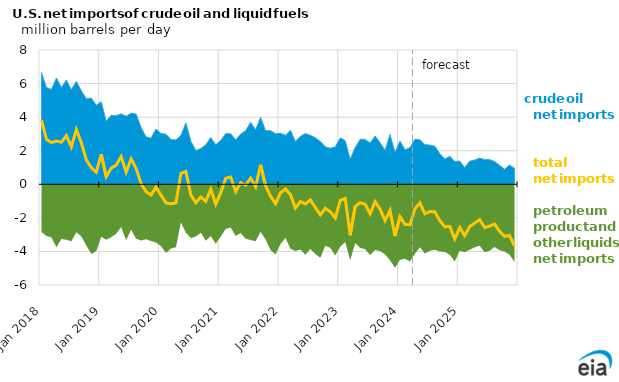
| Category | total net imports  |
|---|---|
| 2018-01-01 | 3.819 |
| 2018-02-01 | 2.679 |
| 2018-03-01 | 2.485 |
| 2018-04-01 | 2.578 |
| 2018-05-01 | 2.51 |
| 2018-06-01 | 2.902 |
| 2018-07-01 | 2.231 |
| 2018-08-01 | 3.27 |
| 2018-09-01 | 2.474 |
| 2018-10-01 | 1.457 |
| 2018-11-01 | 0.991 |
| 2018-12-01 | 0.72 |
| 2019-01-01 | 1.786 |
| 2019-02-01 | 0.452 |
| 2019-03-01 | 0.959 |
| 2019-04-01 | 1.143 |
| 2019-05-01 | 1.655 |
| 2019-06-01 | 0.72 |
| 2019-07-01 | 1.517 |
| 2019-08-01 | 0.949 |
| 2019-09-01 | 0.04 |
| 2019-10-01 | -0.44 |
| 2019-11-01 | -0.638 |
| 2019-12-01 | -0.171 |
| 2020-01-01 | -0.649 |
| 2020-02-01 | -1.108 |
| 2020-03-01 | -1.162 |
| 2020-04-01 | -1.112 |
| 2020-05-01 | 0.65 |
| 2020-06-01 | 0.76 |
| 2020-07-01 | -0.639 |
| 2020-08-01 | -1.1 |
| 2020-09-01 | -0.756 |
| 2020-10-01 | -1.013 |
| 2020-11-01 | -0.297 |
| 2020-12-01 | -1.186 |
| 2021-01-01 | -0.501 |
| 2021-02-01 | 0.357 |
| 2021-03-01 | 0.431 |
| 2021-04-01 | -0.441 |
| 2021-05-01 | 0.098 |
| 2021-06-01 | -0.056 |
| 2021-07-01 | 0.368 |
| 2021-08-01 | -0.153 |
| 2021-09-01 | 1.162 |
| 2021-10-01 | -0.09 |
| 2021-11-01 | -0.71 |
| 2021-12-01 | -1.161 |
| 2022-01-01 | -0.513 |
| 2022-02-01 | -0.278 |
| 2022-03-01 | -0.621 |
| 2022-04-01 | -1.418 |
| 2022-05-01 | -1.031 |
| 2022-06-01 | -1.173 |
| 2022-07-01 | -0.931 |
| 2022-08-01 | -1.38 |
| 2022-09-01 | -1.825 |
| 2022-10-01 | -1.43 |
| 2022-11-01 | -1.637 |
| 2022-12-01 | -2.009 |
| 2023-01-01 | -0.964 |
| 2023-02-01 | -0.843 |
| 2023-03-01 | -3.035 |
| 2023-04-01 | -1.312 |
| 2023-05-01 | -1.1 |
| 2023-06-01 | -1.192 |
| 2023-07-01 | -1.758 |
| 2023-08-01 | -1.03 |
| 2023-09-01 | -1.485 |
| 2023-10-01 | -2.16 |
| 2023-11-01 | -1.556 |
| 2023-12-01 | -3.085 |
| 2024-01-01 | -1.923 |
| 2024-02-01 | -2.385 |
| 2024-03-01 | -2.415 |
| 2024-04-01 | -1.459 |
| 2024-05-01 | -1.108 |
| 2024-06-01 | -1.755 |
| 2024-07-01 | -1.624 |
| 2024-08-01 | -1.64 |
| 2024-09-01 | -2.172 |
| 2024-10-01 | -2.529 |
| 2024-11-01 | -2.514 |
| 2024-12-01 | -3.255 |
| 2025-01-01 | -2.579 |
| 2025-02-01 | -3.061 |
| 2025-03-01 | -2.517 |
| 2025-04-01 | -2.313 |
| 2025-05-01 | -2.104 |
| 2025-06-01 | -2.575 |
| 2025-07-01 | -2.49 |
| 2025-08-01 | -2.372 |
| 2025-09-01 | -2.799 |
| 2025-10-01 | -3.106 |
| 2025-11-01 | -3.052 |
| 2025-12-01 | -3.672 |